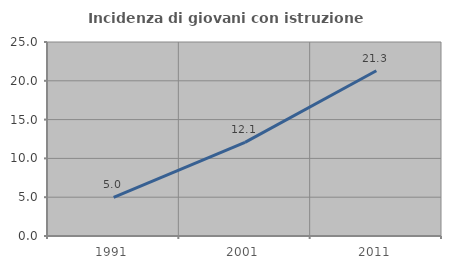
| Category | Incidenza di giovani con istruzione universitaria |
|---|---|
| 1991.0 | 4.975 |
| 2001.0 | 12.06 |
| 2011.0 | 21.29 |